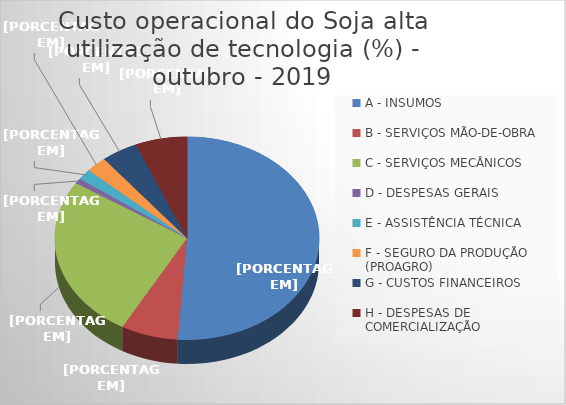
| Category | Series 0 |
|---|---|
| A - INSUMOS | 51.125 |
| B - SERVIÇOS MÃO-DE-OBRA | 6.971 |
| C - SERVIÇOS MECÂNICOS | 26.027 |
| D - DESPESAS GERAIS  | 0.841 |
| E - ASSISTÊNCIA TÉCNICA | 1.699 |
| F - SEGURO DA PRODUÇÃO (PROAGRO) | 2.549 |
| G - CUSTOS FINANCEIROS | 4.461 |
| H - DESPESAS DE COMERCIALIZAÇÃO | 6.327 |